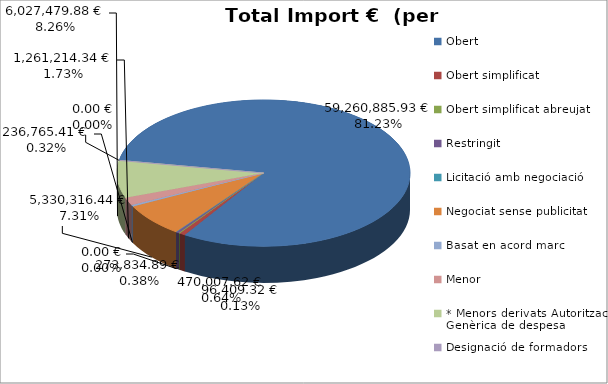
| Category | Total preu              (amb iva) |
|---|---|
| Obert | 59260885.926 |
| Obert simplificat | 470007.62 |
| Obert simplificat abreujat | 96409.318 |
| Restringit | 273834.89 |
| Licitació amb negociació | 0 |
| Negociat sense publicitat | 5330316.442 |
| Basat en acord marc | 236765.41 |
| Menor | 1261214.341 |
| * Menors derivats Autorització Genèrica de despesa | 6027479.88 |
| Designació de formadors | 0 |